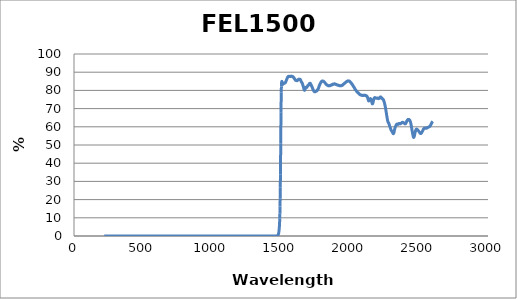
| Category | Series 0 |
|---|---|
| 2600.0 | 62.922 |
| 2599.0 | 62.853 |
| 2598.0 | 62.781 |
| 2597.0 | 62.614 |
| 2596.0 | 62.554 |
| 2595.0 | 62.516 |
| 2594.0 | 62.323 |
| 2593.0 | 62.304 |
| 2592.0 | 62.064 |
| 2591.0 | 61.961 |
| 2590.0 | 61.849 |
| 2589.0 | 61.631 |
| 2588.0 | 61.532 |
| 2587.0 | 61.363 |
| 2586.0 | 61.228 |
| 2585.0 | 60.982 |
| 2584.0 | 60.89 |
| 2583.0 | 60.751 |
| 2582.0 | 60.561 |
| 2581.0 | 60.436 |
| 2580.0 | 60.378 |
| 2579.0 | 60.279 |
| 2578.0 | 60.185 |
| 2577.0 | 60.151 |
| 2576.0 | 60.1 |
| 2575.0 | 60.062 |
| 2574.0 | 59.996 |
| 2573.0 | 60.008 |
| 2572.0 | 59.98 |
| 2571.0 | 59.939 |
| 2570.0 | 59.921 |
| 2569.0 | 59.88 |
| 2568.0 | 59.86 |
| 2567.0 | 59.742 |
| 2566.0 | 59.752 |
| 2565.0 | 59.658 |
| 2564.0 | 59.593 |
| 2563.0 | 59.543 |
| 2562.0 | 59.594 |
| 2561.0 | 59.501 |
| 2560.0 | 59.414 |
| 2559.0 | 59.441 |
| 2558.0 | 59.399 |
| 2557.0 | 59.34 |
| 2556.0 | 59.265 |
| 2555.0 | 59.249 |
| 2554.0 | 59.242 |
| 2553.0 | 59.218 |
| 2552.0 | 59.218 |
| 2551.0 | 59.211 |
| 2550.0 | 59.242 |
| 2549.0 | 59.283 |
| 2548.0 | 59.319 |
| 2547.0 | 59.331 |
| 2546.0 | 59.348 |
| 2545.0 | 59.289 |
| 2544.0 | 59.322 |
| 2543.0 | 59.22 |
| 2542.0 | 59.276 |
| 2541.0 | 59.227 |
| 2540.0 | 59.195 |
| 2539.0 | 59.211 |
| 2538.0 | 59.141 |
| 2537.0 | 59.007 |
| 2536.0 | 59.02 |
| 2535.0 | 58.89 |
| 2534.0 | 58.814 |
| 2533.0 | 58.695 |
| 2532.0 | 58.75 |
| 2531.0 | 58.476 |
| 2530.0 | 58.326 |
| 2529.0 | 58.179 |
| 2528.0 | 58.032 |
| 2527.0 | 57.936 |
| 2526.0 | 57.79 |
| 2525.0 | 57.601 |
| 2524.0 | 57.449 |
| 2523.0 | 57.298 |
| 2522.0 | 57.184 |
| 2521.0 | 57.027 |
| 2520.0 | 56.881 |
| 2519.0 | 56.801 |
| 2518.0 | 56.67 |
| 2517.0 | 56.536 |
| 2516.0 | 56.461 |
| 2515.0 | 56.467 |
| 2514.0 | 56.293 |
| 2513.0 | 56.321 |
| 2512.0 | 56.376 |
| 2511.0 | 56.391 |
| 2510.0 | 56.32 |
| 2509.0 | 56.47 |
| 2508.0 | 56.503 |
| 2507.0 | 56.524 |
| 2506.0 | 56.691 |
| 2505.0 | 56.832 |
| 2504.0 | 56.911 |
| 2503.0 | 57.034 |
| 2502.0 | 57.179 |
| 2501.0 | 57.285 |
| 2500.0 | 57.359 |
| 2499.0 | 57.577 |
| 2498.0 | 57.599 |
| 2497.0 | 57.631 |
| 2496.0 | 57.787 |
| 2495.0 | 57.876 |
| 2494.0 | 57.946 |
| 2493.0 | 58.059 |
| 2492.0 | 58.167 |
| 2491.0 | 58.24 |
| 2490.0 | 58.25 |
| 2489.0 | 58.31 |
| 2488.0 | 58.474 |
| 2487.0 | 58.525 |
| 2486.0 | 58.617 |
| 2485.0 | 58.649 |
| 2484.0 | 58.666 |
| 2483.0 | 58.757 |
| 2482.0 | 58.726 |
| 2481.0 | 58.658 |
| 2480.0 | 58.641 |
| 2479.0 | 58.595 |
| 2478.0 | 58.38 |
| 2477.0 | 58.194 |
| 2476.0 | 57.963 |
| 2475.0 | 57.787 |
| 2474.0 | 57.487 |
| 2473.0 | 57.243 |
| 2472.0 | 56.933 |
| 2471.0 | 56.645 |
| 2470.0 | 56.298 |
| 2469.0 | 55.992 |
| 2468.0 | 55.499 |
| 2467.0 | 55.183 |
| 2466.0 | 54.953 |
| 2465.0 | 54.632 |
| 2464.0 | 54.408 |
| 2463.0 | 54.271 |
| 2462.0 | 54.224 |
| 2461.0 | 54.162 |
| 2460.0 | 54.362 |
| 2459.0 | 54.448 |
| 2458.0 | 54.757 |
| 2457.0 | 55.062 |
| 2456.0 | 55.416 |
| 2455.0 | 55.785 |
| 2454.0 | 56.198 |
| 2453.0 | 56.607 |
| 2452.0 | 57.021 |
| 2451.0 | 57.414 |
| 2450.0 | 57.923 |
| 2449.0 | 58.335 |
| 2448.0 | 58.745 |
| 2447.0 | 59.31 |
| 2446.0 | 59.612 |
| 2445.0 | 60.157 |
| 2444.0 | 60.591 |
| 2443.0 | 60.966 |
| 2442.0 | 61.34 |
| 2441.0 | 61.886 |
| 2440.0 | 62.058 |
| 2439.0 | 62.392 |
| 2438.0 | 62.674 |
| 2437.0 | 62.891 |
| 2436.0 | 63.062 |
| 2435.0 | 63.279 |
| 2434.0 | 63.489 |
| 2433.0 | 63.499 |
| 2432.0 | 63.651 |
| 2431.0 | 63.825 |
| 2430.0 | 63.768 |
| 2429.0 | 63.944 |
| 2428.0 | 64.008 |
| 2427.0 | 63.999 |
| 2426.0 | 63.941 |
| 2425.0 | 64.026 |
| 2424.0 | 63.998 |
| 2423.0 | 64.044 |
| 2422.0 | 64.008 |
| 2421.0 | 63.943 |
| 2420.0 | 63.927 |
| 2419.0 | 63.984 |
| 2418.0 | 63.854 |
| 2417.0 | 63.787 |
| 2416.0 | 63.732 |
| 2415.0 | 63.579 |
| 2414.0 | 63.417 |
| 2413.0 | 63.346 |
| 2412.0 | 63.273 |
| 2411.0 | 62.972 |
| 2410.0 | 62.841 |
| 2409.0 | 62.686 |
| 2408.0 | 62.454 |
| 2407.0 | 62.307 |
| 2406.0 | 62.149 |
| 2405.0 | 61.922 |
| 2404.0 | 61.833 |
| 2403.0 | 61.847 |
| 2402.0 | 61.653 |
| 2401.0 | 61.647 |
| 2400.0 | 61.702 |
| 2399.0 | 61.698 |
| 2398.0 | 61.637 |
| 2397.0 | 61.84 |
| 2396.0 | 61.865 |
| 2395.0 | 61.884 |
| 2394.0 | 61.985 |
| 2393.0 | 61.988 |
| 2392.0 | 61.987 |
| 2391.0 | 62.129 |
| 2390.0 | 62.099 |
| 2389.0 | 62.183 |
| 2388.0 | 62.184 |
| 2387.0 | 62.23 |
| 2386.0 | 62.266 |
| 2385.0 | 62.353 |
| 2384.0 | 62.432 |
| 2383.0 | 62.466 |
| 2382.0 | 62.469 |
| 2381.0 | 62.424 |
| 2380.0 | 62.398 |
| 2379.0 | 62.418 |
| 2378.0 | 62.368 |
| 2377.0 | 62.329 |
| 2376.0 | 62.349 |
| 2375.0 | 62.254 |
| 2374.0 | 62.141 |
| 2373.0 | 62.124 |
| 2372.0 | 61.98 |
| 2371.0 | 61.963 |
| 2370.0 | 61.891 |
| 2369.0 | 61.844 |
| 2368.0 | 61.769 |
| 2367.0 | 61.719 |
| 2366.0 | 61.711 |
| 2365.0 | 61.633 |
| 2364.0 | 61.676 |
| 2363.0 | 61.605 |
| 2362.0 | 61.696 |
| 2361.0 | 61.821 |
| 2360.0 | 61.769 |
| 2359.0 | 61.765 |
| 2358.0 | 61.839 |
| 2357.0 | 61.791 |
| 2356.0 | 61.802 |
| 2355.0 | 61.816 |
| 2354.0 | 61.659 |
| 2353.0 | 61.567 |
| 2352.0 | 61.592 |
| 2351.0 | 61.54 |
| 2350.0 | 61.466 |
| 2349.0 | 61.416 |
| 2348.0 | 61.313 |
| 2347.0 | 61.42 |
| 2346.0 | 61.485 |
| 2345.0 | 61.478 |
| 2344.0 | 61.373 |
| 2343.0 | 61.488 |
| 2342.0 | 61.417 |
| 2341.0 | 61.464 |
| 2340.0 | 61.472 |
| 2339.0 | 61.414 |
| 2338.0 | 61.323 |
| 2337.0 | 61.269 |
| 2336.0 | 61.164 |
| 2335.0 | 61.062 |
| 2334.0 | 60.948 |
| 2333.0 | 60.753 |
| 2332.0 | 60.601 |
| 2331.0 | 60.503 |
| 2330.0 | 60.198 |
| 2329.0 | 60.065 |
| 2328.0 | 59.872 |
| 2327.0 | 59.574 |
| 2326.0 | 59.34 |
| 2325.0 | 59.081 |
| 2324.0 | 58.827 |
| 2323.0 | 58.412 |
| 2322.0 | 58.151 |
| 2321.0 | 57.839 |
| 2320.0 | 57.397 |
| 2319.0 | 57.053 |
| 2318.0 | 56.7 |
| 2317.0 | 56.525 |
| 2316.0 | 56.389 |
| 2315.0 | 56.237 |
| 2314.0 | 56.256 |
| 2313.0 | 56.32 |
| 2312.0 | 56.328 |
| 2311.0 | 56.465 |
| 2310.0 | 56.662 |
| 2309.0 | 56.827 |
| 2308.0 | 57.032 |
| 2307.0 | 57.216 |
| 2306.0 | 57.248 |
| 2305.0 | 57.454 |
| 2304.0 | 57.558 |
| 2303.0 | 57.576 |
| 2302.0 | 57.665 |
| 2301.0 | 57.779 |
| 2300.0 | 57.961 |
| 2299.0 | 58.073 |
| 2298.0 | 58.268 |
| 2297.0 | 58.375 |
| 2296.0 | 58.63 |
| 2295.0 | 58.788 |
| 2294.0 | 59.048 |
| 2293.0 | 59.279 |
| 2292.0 | 59.525 |
| 2291.0 | 59.719 |
| 2290.0 | 59.916 |
| 2289.0 | 60.204 |
| 2288.0 | 60.28 |
| 2287.0 | 60.57 |
| 2286.0 | 60.894 |
| 2285.0 | 61.07 |
| 2284.0 | 61.344 |
| 2283.0 | 61.565 |
| 2282.0 | 61.743 |
| 2281.0 | 61.892 |
| 2280.0 | 62.06 |
| 2279.0 | 62.303 |
| 2278.0 | 62.322 |
| 2277.0 | 62.527 |
| 2276.0 | 62.667 |
| 2275.0 | 62.828 |
| 2274.0 | 63.092 |
| 2273.0 | 63.212 |
| 2272.0 | 63.616 |
| 2271.0 | 63.984 |
| 2270.0 | 64.363 |
| 2269.0 | 64.881 |
| 2268.0 | 65.367 |
| 2267.0 | 65.838 |
| 2266.0 | 66.344 |
| 2265.0 | 66.77 |
| 2264.0 | 67.257 |
| 2263.0 | 67.804 |
| 2262.0 | 68.284 |
| 2261.0 | 68.678 |
| 2260.0 | 69.147 |
| 2259.0 | 69.634 |
| 2258.0 | 70.017 |
| 2257.0 | 70.482 |
| 2256.0 | 70.932 |
| 2255.0 | 71.269 |
| 2254.0 | 71.645 |
| 2253.0 | 72.026 |
| 2252.0 | 72.374 |
| 2251.0 | 72.754 |
| 2250.0 | 73.072 |
| 2249.0 | 73.265 |
| 2248.0 | 73.589 |
| 2247.0 | 73.771 |
| 2246.0 | 74.048 |
| 2245.0 | 74.27 |
| 2244.0 | 74.499 |
| 2243.0 | 74.759 |
| 2242.0 | 74.785 |
| 2241.0 | 74.883 |
| 2240.0 | 75.101 |
| 2239.0 | 75.122 |
| 2238.0 | 75.123 |
| 2237.0 | 75.383 |
| 2236.0 | 75.344 |
| 2235.0 | 75.432 |
| 2234.0 | 75.414 |
| 2233.0 | 75.564 |
| 2232.0 | 75.639 |
| 2231.0 | 75.671 |
| 2230.0 | 75.686 |
| 2229.0 | 75.822 |
| 2228.0 | 75.956 |
| 2227.0 | 75.966 |
| 2226.0 | 76.151 |
| 2225.0 | 76.233 |
| 2224.0 | 76.193 |
| 2223.0 | 76.306 |
| 2222.0 | 76.422 |
| 2221.0 | 76.394 |
| 2220.0 | 76.26 |
| 2219.0 | 76.313 |
| 2218.0 | 76.148 |
| 2217.0 | 76.21 |
| 2216.0 | 76.142 |
| 2215.0 | 76.001 |
| 2214.0 | 75.885 |
| 2213.0 | 75.953 |
| 2212.0 | 75.679 |
| 2211.0 | 75.626 |
| 2210.0 | 75.607 |
| 2209.0 | 75.538 |
| 2208.0 | 75.488 |
| 2207.0 | 75.559 |
| 2206.0 | 75.552 |
| 2205.0 | 75.471 |
| 2204.0 | 75.572 |
| 2203.0 | 75.568 |
| 2202.0 | 75.674 |
| 2201.0 | 75.744 |
| 2200.0 | 75.745 |
| 2199.0 | 75.774 |
| 2198.0 | 75.756 |
| 2197.0 | 75.786 |
| 2196.0 | 75.795 |
| 2195.0 | 75.781 |
| 2194.0 | 75.677 |
| 2193.0 | 75.711 |
| 2192.0 | 75.697 |
| 2191.0 | 75.729 |
| 2190.0 | 75.727 |
| 2189.0 | 75.69 |
| 2188.0 | 75.668 |
| 2187.0 | 75.698 |
| 2186.0 | 75.738 |
| 2185.0 | 75.786 |
| 2184.0 | 75.963 |
| 2183.0 | 75.949 |
| 2182.0 | 75.978 |
| 2181.0 | 75.94 |
| 2180.0 | 76.043 |
| 2179.0 | 76.033 |
| 2178.0 | 75.915 |
| 2177.0 | 75.958 |
| 2176.0 | 75.886 |
| 2175.0 | 75.697 |
| 2174.0 | 75.561 |
| 2173.0 | 75.276 |
| 2172.0 | 75.123 |
| 2171.0 | 74.911 |
| 2170.0 | 74.481 |
| 2169.0 | 74.116 |
| 2168.0 | 73.759 |
| 2167.0 | 73.441 |
| 2166.0 | 73.052 |
| 2165.0 | 72.825 |
| 2164.0 | 72.744 |
| 2163.0 | 72.666 |
| 2162.0 | 72.587 |
| 2161.0 | 72.703 |
| 2160.0 | 73.015 |
| 2159.0 | 73.215 |
| 2158.0 | 73.496 |
| 2157.0 | 73.784 |
| 2156.0 | 74.043 |
| 2155.0 | 74.27 |
| 2154.0 | 74.588 |
| 2153.0 | 74.897 |
| 2152.0 | 75.072 |
| 2151.0 | 75.299 |
| 2150.0 | 75.355 |
| 2149.0 | 75.417 |
| 2148.0 | 75.488 |
| 2147.0 | 75.51 |
| 2146.0 | 75.41 |
| 2145.0 | 75.41 |
| 2144.0 | 75.268 |
| 2143.0 | 75.166 |
| 2142.0 | 74.991 |
| 2141.0 | 74.88 |
| 2140.0 | 74.632 |
| 2139.0 | 74.555 |
| 2138.0 | 74.294 |
| 2137.0 | 74.256 |
| 2136.0 | 74.275 |
| 2135.0 | 74.223 |
| 2134.0 | 74.416 |
| 2133.0 | 74.602 |
| 2132.0 | 74.896 |
| 2131.0 | 75.05 |
| 2130.0 | 75.418 |
| 2129.0 | 75.686 |
| 2128.0 | 75.95 |
| 2127.0 | 76.159 |
| 2126.0 | 76.429 |
| 2125.0 | 76.505 |
| 2124.0 | 76.572 |
| 2123.0 | 76.716 |
| 2122.0 | 76.893 |
| 2121.0 | 76.931 |
| 2120.0 | 76.921 |
| 2119.0 | 76.901 |
| 2118.0 | 77.004 |
| 2117.0 | 76.981 |
| 2116.0 | 77.179 |
| 2115.0 | 77.126 |
| 2114.0 | 77.192 |
| 2113.0 | 77.156 |
| 2112.0 | 77.233 |
| 2111.0 | 77.218 |
| 2110.0 | 77.282 |
| 2109.0 | 77.341 |
| 2108.0 | 77.351 |
| 2107.0 | 77.326 |
| 2106.0 | 77.261 |
| 2105.0 | 77.351 |
| 2104.0 | 77.294 |
| 2103.0 | 77.333 |
| 2102.0 | 77.397 |
| 2101.0 | 77.275 |
| 2100.0 | 77.318 |
| 2099.0 | 77.346 |
| 2098.0 | 77.268 |
| 2097.0 | 77.284 |
| 2096.0 | 77.213 |
| 2095.0 | 77.294 |
| 2094.0 | 77.208 |
| 2093.0 | 77.262 |
| 2092.0 | 77.178 |
| 2091.0 | 77.36 |
| 2090.0 | 77.274 |
| 2089.0 | 77.304 |
| 2088.0 | 77.264 |
| 2087.0 | 77.332 |
| 2086.0 | 77.32 |
| 2085.0 | 77.246 |
| 2084.0 | 77.368 |
| 2083.0 | 77.337 |
| 2082.0 | 77.434 |
| 2081.0 | 77.42 |
| 2080.0 | 77.456 |
| 2079.0 | 77.49 |
| 2078.0 | 77.466 |
| 2077.0 | 77.577 |
| 2076.0 | 77.514 |
| 2075.0 | 77.6 |
| 2074.0 | 77.593 |
| 2073.0 | 77.671 |
| 2072.0 | 77.767 |
| 2071.0 | 77.81 |
| 2070.0 | 77.738 |
| 2069.0 | 77.947 |
| 2068.0 | 78.008 |
| 2067.0 | 78.046 |
| 2066.0 | 78.172 |
| 2065.0 | 78.293 |
| 2064.0 | 78.249 |
| 2063.0 | 78.309 |
| 2062.0 | 78.458 |
| 2061.0 | 78.523 |
| 2060.0 | 78.658 |
| 2059.0 | 78.675 |
| 2058.0 | 78.789 |
| 2057.0 | 78.753 |
| 2056.0 | 78.894 |
| 2055.0 | 78.89 |
| 2054.0 | 78.972 |
| 2053.0 | 78.994 |
| 2052.0 | 79.133 |
| 2051.0 | 79.245 |
| 2050.0 | 79.297 |
| 2049.0 | 79.326 |
| 2048.0 | 79.622 |
| 2047.0 | 79.744 |
| 2046.0 | 79.754 |
| 2045.0 | 79.852 |
| 2044.0 | 79.95 |
| 2043.0 | 80.057 |
| 2042.0 | 80.175 |
| 2041.0 | 80.342 |
| 2040.0 | 80.305 |
| 2039.0 | 80.493 |
| 2038.0 | 80.592 |
| 2037.0 | 80.665 |
| 2036.0 | 80.773 |
| 2035.0 | 81.025 |
| 2034.0 | 81.056 |
| 2033.0 | 81.262 |
| 2032.0 | 81.293 |
| 2031.0 | 81.463 |
| 2030.0 | 81.552 |
| 2029.0 | 81.839 |
| 2028.0 | 81.787 |
| 2027.0 | 81.995 |
| 2026.0 | 82.133 |
| 2025.0 | 82.195 |
| 2024.0 | 82.31 |
| 2023.0 | 82.413 |
| 2022.0 | 82.669 |
| 2021.0 | 82.753 |
| 2020.0 | 82.828 |
| 2019.0 | 82.917 |
| 2018.0 | 82.995 |
| 2017.0 | 83.15 |
| 2016.0 | 83.359 |
| 2015.0 | 83.351 |
| 2014.0 | 83.509 |
| 2013.0 | 83.582 |
| 2012.0 | 83.629 |
| 2011.0 | 83.734 |
| 2010.0 | 83.959 |
| 2009.0 | 84.012 |
| 2008.0 | 83.976 |
| 2007.0 | 84.212 |
| 2006.0 | 84.289 |
| 2005.0 | 84.376 |
| 2004.0 | 84.459 |
| 2003.0 | 84.506 |
| 2002.0 | 84.541 |
| 2001.0 | 84.606 |
| 2000.0 | 84.727 |
| 1999.0 | 84.93 |
| 1998.0 | 84.909 |
| 1997.0 | 84.921 |
| 1996.0 | 84.986 |
| 1995.0 | 85.028 |
| 1994.0 | 85.162 |
| 1993.0 | 85.141 |
| 1992.0 | 85.142 |
| 1991.0 | 85.231 |
| 1990.0 | 85.216 |
| 1989.0 | 85.168 |
| 1988.0 | 85.13 |
| 1987.0 | 85.239 |
| 1986.0 | 85.146 |
| 1985.0 | 85.221 |
| 1984.0 | 85.228 |
| 1983.0 | 85.126 |
| 1982.0 | 85.049 |
| 1981.0 | 85.082 |
| 1980.0 | 85.091 |
| 1979.0 | 84.988 |
| 1978.0 | 84.993 |
| 1977.0 | 84.827 |
| 1976.0 | 84.837 |
| 1975.0 | 84.802 |
| 1974.0 | 84.788 |
| 1973.0 | 84.623 |
| 1972.0 | 84.632 |
| 1971.0 | 84.581 |
| 1970.0 | 84.594 |
| 1969.0 | 84.396 |
| 1968.0 | 84.377 |
| 1967.0 | 84.339 |
| 1966.0 | 84.269 |
| 1965.0 | 84.205 |
| 1964.0 | 84.123 |
| 1963.0 | 84.104 |
| 1962.0 | 84.022 |
| 1961.0 | 83.856 |
| 1960.0 | 83.864 |
| 1959.0 | 83.768 |
| 1958.0 | 83.818 |
| 1957.0 | 83.707 |
| 1956.0 | 83.648 |
| 1955.0 | 83.552 |
| 1954.0 | 83.533 |
| 1953.0 | 83.402 |
| 1952.0 | 83.397 |
| 1951.0 | 83.281 |
| 1950.0 | 83.278 |
| 1949.0 | 83.225 |
| 1948.0 | 83.023 |
| 1947.0 | 83.05 |
| 1946.0 | 82.954 |
| 1945.0 | 82.822 |
| 1944.0 | 82.809 |
| 1943.0 | 82.744 |
| 1942.0 | 82.821 |
| 1941.0 | 82.716 |
| 1940.0 | 82.655 |
| 1939.0 | 82.635 |
| 1938.0 | 82.582 |
| 1937.0 | 82.717 |
| 1936.0 | 82.555 |
| 1935.0 | 82.66 |
| 1934.0 | 82.563 |
| 1933.0 | 82.665 |
| 1932.0 | 82.617 |
| 1931.0 | 82.612 |
| 1930.0 | 82.53 |
| 1929.0 | 82.49 |
| 1928.0 | 82.52 |
| 1927.0 | 82.546 |
| 1926.0 | 82.536 |
| 1925.0 | 82.56 |
| 1924.0 | 82.632 |
| 1923.0 | 82.534 |
| 1922.0 | 82.595 |
| 1921.0 | 82.595 |
| 1920.0 | 82.67 |
| 1919.0 | 82.773 |
| 1918.0 | 82.805 |
| 1917.0 | 82.718 |
| 1916.0 | 82.789 |
| 1915.0 | 82.773 |
| 1914.0 | 82.765 |
| 1913.0 | 82.769 |
| 1912.0 | 82.798 |
| 1911.0 | 82.881 |
| 1910.0 | 82.909 |
| 1909.0 | 83.013 |
| 1908.0 | 83.001 |
| 1907.0 | 83.032 |
| 1906.0 | 83.053 |
| 1905.0 | 83.13 |
| 1904.0 | 83.071 |
| 1903.0 | 83.173 |
| 1902.0 | 83.266 |
| 1901.0 | 83.129 |
| 1900.0 | 83.249 |
| 1899.0 | 83.327 |
| 1898.0 | 83.287 |
| 1897.0 | 83.346 |
| 1896.0 | 83.394 |
| 1895.0 | 83.352 |
| 1894.0 | 83.381 |
| 1893.0 | 83.509 |
| 1892.0 | 83.417 |
| 1891.0 | 83.551 |
| 1890.0 | 83.54 |
| 1889.0 | 83.666 |
| 1888.0 | 83.602 |
| 1887.0 | 83.56 |
| 1886.0 | 83.49 |
| 1885.0 | 83.551 |
| 1884.0 | 83.441 |
| 1883.0 | 83.44 |
| 1882.0 | 83.425 |
| 1881.0 | 83.452 |
| 1880.0 | 83.455 |
| 1879.0 | 83.483 |
| 1878.0 | 83.364 |
| 1877.0 | 83.291 |
| 1876.0 | 83.45 |
| 1875.0 | 83.341 |
| 1874.0 | 83.31 |
| 1873.0 | 83.302 |
| 1872.0 | 83.259 |
| 1871.0 | 83.246 |
| 1870.0 | 83.221 |
| 1869.0 | 83.007 |
| 1868.0 | 83.047 |
| 1867.0 | 82.978 |
| 1866.0 | 83.068 |
| 1865.0 | 82.993 |
| 1864.0 | 82.848 |
| 1863.0 | 82.964 |
| 1862.0 | 82.779 |
| 1861.0 | 82.779 |
| 1860.0 | 82.769 |
| 1859.0 | 82.77 |
| 1858.0 | 82.787 |
| 1857.0 | 82.764 |
| 1856.0 | 82.61 |
| 1855.0 | 82.67 |
| 1854.0 | 82.626 |
| 1853.0 | 82.646 |
| 1852.0 | 82.555 |
| 1851.0 | 82.574 |
| 1850.0 | 82.565 |
| 1849.0 | 82.507 |
| 1848.0 | 82.533 |
| 1847.0 | 82.488 |
| 1846.0 | 82.557 |
| 1845.0 | 82.63 |
| 1844.0 | 82.496 |
| 1843.0 | 82.556 |
| 1842.0 | 82.567 |
| 1841.0 | 82.717 |
| 1840.0 | 82.644 |
| 1839.0 | 82.699 |
| 1838.0 | 82.717 |
| 1837.0 | 82.893 |
| 1836.0 | 82.826 |
| 1835.0 | 82.897 |
| 1834.0 | 82.995 |
| 1833.0 | 82.915 |
| 1832.0 | 83.019 |
| 1831.0 | 83.047 |
| 1830.0 | 83.153 |
| 1829.0 | 83.295 |
| 1828.0 | 83.326 |
| 1827.0 | 83.356 |
| 1826.0 | 83.47 |
| 1825.0 | 83.657 |
| 1824.0 | 83.734 |
| 1823.0 | 83.798 |
| 1822.0 | 83.823 |
| 1821.0 | 84.021 |
| 1820.0 | 84.113 |
| 1819.0 | 84.209 |
| 1818.0 | 84.227 |
| 1817.0 | 84.269 |
| 1816.0 | 84.522 |
| 1815.0 | 84.455 |
| 1814.0 | 84.637 |
| 1813.0 | 84.64 |
| 1812.0 | 84.755 |
| 1811.0 | 84.73 |
| 1810.0 | 84.788 |
| 1809.0 | 84.933 |
| 1808.0 | 85.012 |
| 1807.0 | 84.944 |
| 1806.0 | 85.025 |
| 1805.0 | 85.042 |
| 1804.0 | 85.137 |
| 1803.0 | 85.087 |
| 1802.0 | 85.141 |
| 1801.0 | 85.075 |
| 1800.0 | 85.106 |
| 1799.0 | 85.079 |
| 1798.0 | 85.013 |
| 1797.0 | 85.106 |
| 1796.0 | 85.066 |
| 1795.0 | 84.956 |
| 1794.0 | 84.862 |
| 1793.0 | 84.791 |
| 1792.0 | 84.745 |
| 1791.0 | 84.59 |
| 1790.0 | 84.469 |
| 1789.0 | 84.451 |
| 1788.0 | 84.28 |
| 1787.0 | 84.149 |
| 1786.0 | 84.044 |
| 1785.0 | 83.785 |
| 1784.0 | 83.726 |
| 1783.0 | 83.558 |
| 1782.0 | 83.369 |
| 1781.0 | 83.246 |
| 1780.0 | 83.068 |
| 1779.0 | 82.859 |
| 1778.0 | 82.512 |
| 1777.0 | 82.411 |
| 1776.0 | 82.305 |
| 1775.0 | 81.951 |
| 1774.0 | 81.783 |
| 1773.0 | 81.604 |
| 1772.0 | 81.372 |
| 1771.0 | 81.095 |
| 1770.0 | 80.878 |
| 1769.0 | 80.902 |
| 1768.0 | 80.645 |
| 1767.0 | 80.615 |
| 1766.0 | 80.462 |
| 1765.0 | 80.385 |
| 1764.0 | 80.227 |
| 1763.0 | 80.229 |
| 1762.0 | 80.145 |
| 1761.0 | 79.983 |
| 1760.0 | 79.75 |
| 1759.0 | 79.733 |
| 1758.0 | 79.69 |
| 1757.0 | 79.577 |
| 1756.0 | 79.572 |
| 1755.0 | 79.548 |
| 1754.0 | 79.525 |
| 1753.0 | 79.488 |
| 1752.0 | 79.483 |
| 1751.0 | 79.425 |
| 1750.0 | 79.41 |
| 1749.0 | 79.432 |
| 1748.0 | 79.401 |
| 1747.0 | 79.27 |
| 1746.0 | 79.461 |
| 1745.0 | 79.26 |
| 1744.0 | 79.297 |
| 1743.0 | 79.313 |
| 1742.0 | 79.231 |
| 1741.0 | 79.314 |
| 1740.0 | 79.405 |
| 1739.0 | 79.485 |
| 1738.0 | 79.657 |
| 1737.0 | 79.855 |
| 1736.0 | 79.877 |
| 1735.0 | 80.084 |
| 1734.0 | 80.199 |
| 1733.0 | 80.436 |
| 1732.0 | 80.547 |
| 1731.0 | 80.773 |
| 1730.0 | 80.894 |
| 1729.0 | 81.068 |
| 1728.0 | 81.321 |
| 1727.0 | 81.471 |
| 1726.0 | 81.75 |
| 1725.0 | 81.8 |
| 1724.0 | 82.142 |
| 1723.0 | 82.169 |
| 1722.0 | 82.362 |
| 1721.0 | 82.556 |
| 1720.0 | 82.608 |
| 1719.0 | 82.931 |
| 1718.0 | 83.005 |
| 1717.0 | 83.293 |
| 1716.0 | 83.329 |
| 1715.0 | 83.503 |
| 1714.0 | 83.61 |
| 1713.0 | 83.839 |
| 1712.0 | 83.756 |
| 1711.0 | 83.878 |
| 1710.0 | 83.83 |
| 1709.0 | 83.862 |
| 1708.0 | 83.868 |
| 1707.0 | 83.74 |
| 1706.0 | 83.741 |
| 1705.0 | 83.578 |
| 1704.0 | 83.446 |
| 1703.0 | 83.353 |
| 1702.0 | 83.25 |
| 1701.0 | 83.01 |
| 1700.0 | 82.972 |
| 1699.0 | 82.844 |
| 1698.0 | 82.782 |
| 1697.0 | 82.82 |
| 1696.0 | 82.781 |
| 1695.0 | 82.725 |
| 1694.0 | 82.58 |
| 1693.0 | 82.506 |
| 1692.0 | 82.279 |
| 1691.0 | 82.19 |
| 1690.0 | 81.991 |
| 1689.0 | 81.916 |
| 1688.0 | 81.72 |
| 1687.0 | 81.724 |
| 1686.0 | 81.662 |
| 1685.0 | 81.632 |
| 1684.0 | 81.713 |
| 1683.0 | 81.702 |
| 1682.0 | 81.702 |
| 1681.0 | 81.69 |
| 1680.0 | 81.592 |
| 1679.0 | 81.541 |
| 1678.0 | 81.34 |
| 1677.0 | 81.104 |
| 1676.0 | 80.96 |
| 1675.0 | 80.745 |
| 1674.0 | 80.558 |
| 1673.0 | 80.45 |
| 1672.0 | 80.234 |
| 1671.0 | 80.014 |
| 1670.0 | 80.203 |
| 1669.0 | 80.247 |
| 1668.0 | 80.171 |
| 1667.0 | 80.459 |
| 1666.0 | 80.718 |
| 1665.0 | 81.099 |
| 1664.0 | 81.41 |
| 1663.0 | 81.694 |
| 1662.0 | 82.035 |
| 1661.0 | 82.313 |
| 1660.0 | 82.516 |
| 1659.0 | 82.827 |
| 1658.0 | 82.985 |
| 1657.0 | 83.183 |
| 1656.0 | 83.545 |
| 1655.0 | 83.751 |
| 1654.0 | 83.889 |
| 1653.0 | 84.059 |
| 1652.0 | 84.257 |
| 1651.0 | 84.356 |
| 1650.0 | 84.401 |
| 1649.0 | 84.576 |
| 1648.0 | 84.678 |
| 1647.0 | 84.73 |
| 1646.0 | 85.055 |
| 1645.0 | 85.07 |
| 1644.0 | 85.303 |
| 1643.0 | 85.513 |
| 1642.0 | 85.747 |
| 1641.0 | 85.742 |
| 1640.0 | 85.934 |
| 1639.0 | 86.021 |
| 1638.0 | 86.103 |
| 1637.0 | 85.986 |
| 1636.0 | 86.154 |
| 1635.0 | 86.067 |
| 1634.0 | 86.116 |
| 1633.0 | 86.018 |
| 1632.0 | 86.05 |
| 1631.0 | 86.163 |
| 1630.0 | 86.091 |
| 1629.0 | 86.17 |
| 1628.0 | 86.012 |
| 1627.0 | 85.979 |
| 1626.0 | 85.917 |
| 1625.0 | 85.917 |
| 1624.0 | 85.916 |
| 1623.0 | 85.802 |
| 1622.0 | 85.6 |
| 1621.0 | 85.701 |
| 1620.0 | 85.582 |
| 1619.0 | 85.536 |
| 1618.0 | 85.445 |
| 1617.0 | 85.331 |
| 1616.0 | 85.473 |
| 1615.0 | 85.389 |
| 1614.0 | 85.39 |
| 1613.0 | 85.421 |
| 1612.0 | 85.454 |
| 1611.0 | 85.378 |
| 1610.0 | 85.506 |
| 1609.0 | 85.604 |
| 1608.0 | 85.543 |
| 1607.0 | 85.498 |
| 1606.0 | 85.551 |
| 1605.0 | 85.577 |
| 1604.0 | 85.755 |
| 1603.0 | 85.814 |
| 1602.0 | 85.934 |
| 1601.0 | 86.023 |
| 1600.0 | 86.099 |
| 1599.0 | 86.317 |
| 1598.0 | 86.4 |
| 1597.0 | 86.552 |
| 1596.0 | 86.593 |
| 1595.0 | 86.656 |
| 1594.0 | 86.988 |
| 1593.0 | 86.936 |
| 1592.0 | 86.922 |
| 1591.0 | 87.149 |
| 1590.0 | 87.141 |
| 1589.0 | 87.312 |
| 1588.0 | 87.397 |
| 1587.0 | 87.474 |
| 1586.0 | 87.456 |
| 1585.0 | 87.625 |
| 1584.0 | 87.652 |
| 1583.0 | 87.695 |
| 1582.0 | 87.714 |
| 1581.0 | 87.734 |
| 1580.0 | 87.726 |
| 1579.0 | 87.782 |
| 1578.0 | 87.685 |
| 1577.0 | 87.839 |
| 1576.0 | 87.74 |
| 1575.0 | 87.796 |
| 1574.0 | 87.777 |
| 1573.0 | 87.757 |
| 1572.0 | 87.707 |
| 1571.0 | 87.744 |
| 1570.0 | 87.762 |
| 1569.0 | 87.681 |
| 1568.0 | 87.643 |
| 1567.0 | 87.723 |
| 1566.0 | 87.617 |
| 1565.0 | 87.741 |
| 1564.0 | 87.743 |
| 1563.0 | 87.663 |
| 1562.0 | 87.678 |
| 1561.0 | 87.649 |
| 1560.0 | 87.7 |
| 1559.0 | 87.667 |
| 1558.0 | 87.675 |
| 1557.0 | 87.694 |
| 1556.0 | 87.751 |
| 1555.0 | 87.651 |
| 1554.0 | 87.614 |
| 1553.0 | 87.664 |
| 1552.0 | 87.597 |
| 1551.0 | 87.568 |
| 1550.0 | 87.392 |
| 1549.0 | 87.279 |
| 1548.0 | 87.131 |
| 1547.0 | 87.113 |
| 1546.0 | 86.893 |
| 1545.0 | 86.729 |
| 1544.0 | 86.597 |
| 1543.0 | 86.376 |
| 1542.0 | 86.158 |
| 1541.0 | 85.967 |
| 1540.0 | 85.796 |
| 1539.0 | 85.521 |
| 1538.0 | 85.336 |
| 1537.0 | 85.153 |
| 1536.0 | 84.978 |
| 1535.0 | 84.852 |
| 1534.0 | 84.646 |
| 1533.0 | 84.448 |
| 1532.0 | 84.345 |
| 1531.0 | 84.181 |
| 1530.0 | 84.29 |
| 1529.0 | 84.184 |
| 1528.0 | 84.101 |
| 1527.0 | 84.082 |
| 1526.0 | 83.952 |
| 1525.0 | 83.984 |
| 1524.0 | 83.889 |
| 1523.0 | 83.858 |
| 1522.0 | 83.837 |
| 1521.0 | 83.985 |
| 1520.0 | 83.949 |
| 1519.0 | 83.919 |
| 1518.0 | 83.788 |
| 1517.0 | 83.634 |
| 1516.0 | 83.638 |
| 1515.0 | 83.427 |
| 1514.0 | 83.47 |
| 1513.0 | 83.603 |
| 1512.0 | 83.641 |
| 1511.0 | 83.857 |
| 1510.0 | 84.082 |
| 1509.0 | 84.361 |
| 1508.0 | 84.606 |
| 1507.0 | 84.811 |
| 1506.0 | 84.978 |
| 1505.0 | 84.806 |
| 1504.0 | 83.837 |
| 1503.0 | 82.109 |
| 1502.0 | 78.982 |
| 1501.0 | 74.184 |
| 1500.0 | 67.652 |
| 1499.0 | 59.836 |
| 1498.0 | 50.749 |
| 1497.0 | 41.875 |
| 1496.0 | 33.716 |
| 1495.0 | 26.776 |
| 1494.0 | 20.804 |
| 1493.0 | 16.229 |
| 1492.0 | 12.526 |
| 1491.0 | 9.69 |
| 1490.0 | 7.616 |
| 1489.0 | 6.05 |
| 1488.0 | 4.834 |
| 1487.0 | 3.947 |
| 1486.0 | 3.233 |
| 1485.0 | 2.571 |
| 1484.0 | 1.979 |
| 1483.0 | 1.539 |
| 1482.0 | 1.194 |
| 1481.0 | 0.93 |
| 1480.0 | 0.732 |
| 1479.0 | 0.573 |
| 1478.0 | 0.452 |
| 1477.0 | 0.36 |
| 1476.0 | 0.289 |
| 1475.0 | 0.232 |
| 1474.0 | 0.188 |
| 1473.0 | 0.152 |
| 1472.0 | 0.123 |
| 1471.0 | 0.1 |
| 1470.0 | 0.083 |
| 1469.0 | 0.068 |
| 1468.0 | 0.056 |
| 1467.0 | 0.047 |
| 1466.0 | 0.039 |
| 1465.0 | 0.032 |
| 1464.0 | 0.027 |
| 1463.0 | 0.023 |
| 1462.0 | 0.019 |
| 1461.0 | 0.016 |
| 1460.0 | 0.014 |
| 1459.0 | 0.012 |
| 1458.0 | 0.01 |
| 1457.0 | 0.008 |
| 1456.0 | 0.007 |
| 1455.0 | 0.006 |
| 1454.0 | 0.005 |
| 1453.0 | 0.005 |
| 1452.0 | 0.004 |
| 1451.0 | 0.003 |
| 1450.0 | 0.003 |
| 1449.0 | 0.003 |
| 1448.0 | 0.002 |
| 1447.0 | 0.002 |
| 1446.0 | 0.002 |
| 1445.0 | 0.002 |
| 1444.0 | 0.001 |
| 1443.0 | 0.001 |
| 1442.0 | 0.001 |
| 1441.0 | 0.001 |
| 1440.0 | 0.001 |
| 1439.0 | 0.001 |
| 1438.0 | 0.001 |
| 1437.0 | 0.001 |
| 1436.0 | 0.001 |
| 1435.0 | 0.001 |
| 1434.0 | 0 |
| 1433.0 | 0.001 |
| 1432.0 | 0.001 |
| 1431.0 | 0 |
| 1430.0 | 0 |
| 1429.0 | 0 |
| 1428.0 | 0 |
| 1427.0 | 0 |
| 1426.0 | 0 |
| 1425.0 | 0 |
| 1424.0 | 0 |
| 1423.0 | 0 |
| 1422.0 | 0 |
| 1421.0 | 0 |
| 1420.0 | 0 |
| 1419.0 | 0 |
| 1418.0 | 0 |
| 1417.0 | 0 |
| 1416.0 | 0 |
| 1415.0 | 0 |
| 1414.0 | 0 |
| 1413.0 | 0 |
| 1412.0 | 0 |
| 1411.0 | 0 |
| 1410.0 | 0 |
| 1409.0 | 0 |
| 1408.0 | 0 |
| 1407.0 | 0 |
| 1406.0 | 0 |
| 1405.0 | 0 |
| 1404.0 | 0 |
| 1403.0 | 0 |
| 1402.0 | 0 |
| 1401.0 | 0 |
| 1400.0 | 0 |
| 1399.0 | 0 |
| 1398.0 | 0 |
| 1397.0 | 0 |
| 1396.0 | 0 |
| 1395.0 | 0 |
| 1394.0 | 0 |
| 1393.0 | 0 |
| 1392.0 | 0 |
| 1391.0 | 0 |
| 1390.0 | 0 |
| 1389.0 | 0 |
| 1388.0 | 0 |
| 1387.0 | 0 |
| 1386.0 | 0 |
| 1385.0 | 0 |
| 1384.0 | 0 |
| 1383.0 | 0 |
| 1382.0 | 0 |
| 1381.0 | 0 |
| 1380.0 | 0 |
| 1379.0 | 0 |
| 1378.0 | 0 |
| 1377.0 | 0 |
| 1376.0 | 0 |
| 1375.0 | 0 |
| 1374.0 | 0 |
| 1373.0 | 0 |
| 1372.0 | 0 |
| 1371.0 | 0 |
| 1370.0 | 0 |
| 1369.0 | 0 |
| 1368.0 | 0 |
| 1367.0 | 0 |
| 1366.0 | 0 |
| 1365.0 | 0 |
| 1364.0 | 0 |
| 1363.0 | 0 |
| 1362.0 | 0 |
| 1361.0 | 0 |
| 1360.0 | 0 |
| 1359.0 | 0 |
| 1358.0 | 0 |
| 1357.0 | 0 |
| 1356.0 | 0 |
| 1355.0 | 0 |
| 1354.0 | 0 |
| 1353.0 | 0 |
| 1352.0 | 0 |
| 1351.0 | 0 |
| 1350.0 | 0 |
| 1349.0 | 0 |
| 1348.0 | 0 |
| 1347.0 | 0 |
| 1346.0 | 0 |
| 1345.0 | 0 |
| 1344.0 | 0 |
| 1343.0 | 0 |
| 1342.0 | 0 |
| 1341.0 | 0 |
| 1340.0 | 0 |
| 1339.0 | 0 |
| 1338.0 | 0 |
| 1337.0 | 0 |
| 1336.0 | 0 |
| 1335.0 | 0 |
| 1334.0 | 0 |
| 1333.0 | 0 |
| 1332.0 | 0 |
| 1331.0 | 0 |
| 1330.0 | 0 |
| 1329.0 | 0 |
| 1328.0 | 0 |
| 1327.0 | 0 |
| 1326.0 | 0 |
| 1325.0 | 0 |
| 1324.0 | 0 |
| 1323.0 | 0 |
| 1322.0 | 0 |
| 1321.0 | 0 |
| 1320.0 | 0 |
| 1319.0 | 0 |
| 1318.0 | 0 |
| 1317.0 | 0 |
| 1316.0 | 0 |
| 1315.0 | 0 |
| 1314.0 | 0 |
| 1313.0 | 0 |
| 1312.0 | 0 |
| 1311.0 | 0 |
| 1310.0 | 0 |
| 1309.0 | 0 |
| 1308.0 | 0 |
| 1307.0 | 0 |
| 1306.0 | 0 |
| 1305.0 | 0 |
| 1304.0 | 0 |
| 1303.0 | 0 |
| 1302.0 | 0 |
| 1301.0 | 0 |
| 1300.0 | 0 |
| 1299.0 | 0 |
| 1298.0 | 0 |
| 1297.0 | 0 |
| 1296.0 | 0 |
| 1295.0 | 0 |
| 1294.0 | 0 |
| 1293.0 | 0 |
| 1292.0 | 0 |
| 1291.0 | 0 |
| 1290.0 | 0 |
| 1289.0 | 0 |
| 1288.0 | 0 |
| 1287.0 | 0 |
| 1286.0 | 0 |
| 1285.0 | 0 |
| 1284.0 | 0 |
| 1283.0 | 0 |
| 1282.0 | 0 |
| 1281.0 | 0 |
| 1280.0 | 0 |
| 1279.0 | 0 |
| 1278.0 | 0 |
| 1277.0 | 0 |
| 1276.0 | 0 |
| 1275.0 | 0 |
| 1274.0 | 0 |
| 1273.0 | 0 |
| 1272.0 | 0 |
| 1271.0 | 0 |
| 1270.0 | 0 |
| 1269.0 | 0 |
| 1268.0 | 0 |
| 1267.0 | 0 |
| 1266.0 | 0 |
| 1265.0 | 0 |
| 1264.0 | 0 |
| 1263.0 | 0 |
| 1262.0 | 0 |
| 1261.0 | 0 |
| 1260.0 | 0 |
| 1259.0 | 0 |
| 1258.0 | 0 |
| 1257.0 | 0 |
| 1256.0 | 0 |
| 1255.0 | 0 |
| 1254.0 | 0 |
| 1253.0 | 0 |
| 1252.0 | 0 |
| 1251.0 | 0 |
| 1250.0 | 0 |
| 1249.0 | 0 |
| 1248.0 | 0 |
| 1247.0 | 0 |
| 1246.0 | 0 |
| 1245.0 | 0 |
| 1244.0 | 0 |
| 1243.0 | 0 |
| 1242.0 | 0 |
| 1241.0 | 0 |
| 1240.0 | 0 |
| 1239.0 | 0 |
| 1238.0 | 0 |
| 1237.0 | 0 |
| 1236.0 | 0 |
| 1235.0 | 0 |
| 1234.0 | 0 |
| 1233.0 | 0 |
| 1232.0 | 0 |
| 1231.0 | 0 |
| 1230.0 | 0 |
| 1229.0 | 0 |
| 1228.0 | 0 |
| 1227.0 | 0 |
| 1226.0 | 0 |
| 1225.0 | 0 |
| 1224.0 | 0 |
| 1223.0 | 0 |
| 1222.0 | 0 |
| 1221.0 | 0 |
| 1220.0 | 0 |
| 1219.0 | 0 |
| 1218.0 | 0 |
| 1217.0 | 0 |
| 1216.0 | 0 |
| 1215.0 | 0 |
| 1214.0 | 0 |
| 1213.0 | 0 |
| 1212.0 | 0 |
| 1211.0 | 0 |
| 1210.0 | 0 |
| 1209.0 | 0 |
| 1208.0 | 0 |
| 1207.0 | 0 |
| 1206.0 | 0 |
| 1205.0 | 0 |
| 1204.0 | 0 |
| 1203.0 | 0 |
| 1202.0 | 0 |
| 1201.0 | 0 |
| 1200.0 | 0 |
| 1199.0 | 0 |
| 1198.0 | 0 |
| 1197.0 | 0 |
| 1196.0 | 0 |
| 1195.0 | 0 |
| 1194.0 | 0 |
| 1193.0 | 0 |
| 1192.0 | 0 |
| 1191.0 | 0 |
| 1190.0 | 0 |
| 1189.0 | 0 |
| 1188.0 | 0 |
| 1187.0 | 0 |
| 1186.0 | 0 |
| 1185.0 | 0 |
| 1184.0 | 0 |
| 1183.0 | 0 |
| 1182.0 | 0 |
| 1181.0 | 0 |
| 1180.0 | 0 |
| 1179.0 | 0 |
| 1178.0 | 0 |
| 1177.0 | 0 |
| 1176.0 | 0 |
| 1175.0 | 0 |
| 1174.0 | 0 |
| 1173.0 | 0 |
| 1172.0 | 0 |
| 1171.0 | 0 |
| 1170.0 | 0 |
| 1169.0 | 0 |
| 1168.0 | 0 |
| 1167.0 | 0 |
| 1166.0 | 0 |
| 1165.0 | 0 |
| 1164.0 | 0 |
| 1163.0 | 0 |
| 1162.0 | 0 |
| 1161.0 | 0 |
| 1160.0 | 0 |
| 1159.0 | 0 |
| 1158.0 | 0 |
| 1157.0 | 0 |
| 1156.0 | 0 |
| 1155.0 | 0 |
| 1154.0 | 0 |
| 1153.0 | 0 |
| 1152.0 | 0 |
| 1151.0 | 0 |
| 1150.0 | 0 |
| 1149.0 | 0 |
| 1148.0 | 0 |
| 1147.0 | 0 |
| 1146.0 | 0 |
| 1145.0 | 0 |
| 1144.0 | 0 |
| 1143.0 | 0 |
| 1142.0 | 0 |
| 1141.0 | 0 |
| 1140.0 | 0 |
| 1139.0 | 0 |
| 1138.0 | 0 |
| 1137.0 | 0 |
| 1136.0 | 0 |
| 1135.0 | 0 |
| 1134.0 | 0 |
| 1133.0 | 0 |
| 1132.0 | 0 |
| 1131.0 | 0 |
| 1130.0 | 0 |
| 1129.0 | 0 |
| 1128.0 | 0 |
| 1127.0 | 0 |
| 1126.0 | 0 |
| 1125.0 | 0 |
| 1124.0 | 0 |
| 1123.0 | 0 |
| 1122.0 | 0 |
| 1121.0 | 0 |
| 1120.0 | 0 |
| 1119.0 | 0 |
| 1118.0 | 0 |
| 1117.0 | 0 |
| 1116.0 | 0 |
| 1115.0 | 0 |
| 1114.0 | 0 |
| 1113.0 | 0 |
| 1112.0 | 0 |
| 1111.0 | 0 |
| 1110.0 | 0 |
| 1109.0 | 0 |
| 1108.0 | 0 |
| 1107.0 | 0 |
| 1106.0 | 0 |
| 1105.0 | 0 |
| 1104.0 | 0 |
| 1103.0 | 0 |
| 1102.0 | 0 |
| 1101.0 | 0 |
| 1100.0 | 0 |
| 1099.0 | 0 |
| 1098.0 | 0 |
| 1097.0 | 0 |
| 1096.0 | 0 |
| 1095.0 | 0 |
| 1094.0 | 0 |
| 1093.0 | 0 |
| 1092.0 | 0 |
| 1091.0 | 0 |
| 1090.0 | 0 |
| 1089.0 | 0 |
| 1088.0 | 0 |
| 1087.0 | 0 |
| 1086.0 | 0 |
| 1085.0 | 0 |
| 1084.0 | 0 |
| 1083.0 | 0 |
| 1082.0 | 0 |
| 1081.0 | 0 |
| 1080.0 | 0 |
| 1079.0 | 0 |
| 1078.0 | 0 |
| 1077.0 | 0 |
| 1076.0 | 0 |
| 1075.0 | 0 |
| 1074.0 | 0 |
| 1073.0 | 0 |
| 1072.0 | 0 |
| 1071.0 | 0 |
| 1070.0 | 0 |
| 1069.0 | 0 |
| 1068.0 | 0 |
| 1067.0 | 0 |
| 1066.0 | 0 |
| 1065.0 | 0 |
| 1064.0 | 0.001 |
| 1063.0 | 0.001 |
| 1062.0 | 0.001 |
| 1061.0 | 0.001 |
| 1060.0 | 0.001 |
| 1059.0 | 0.001 |
| 1058.0 | 0.001 |
| 1057.0 | 0.001 |
| 1056.0 | 0.001 |
| 1055.0 | 0.001 |
| 1054.0 | 0.001 |
| 1053.0 | 0.001 |
| 1052.0 | 0 |
| 1051.0 | 0 |
| 1050.0 | 0 |
| 1049.0 | 0 |
| 1048.0 | 0.001 |
| 1047.0 | 0.001 |
| 1046.0 | 0.001 |
| 1045.0 | 0.001 |
| 1044.0 | 0.001 |
| 1043.0 | 0.001 |
| 1042.0 | 0.002 |
| 1041.0 | 0.002 |
| 1040.0 | 0.002 |
| 1039.0 | 0.002 |
| 1038.0 | 0.001 |
| 1037.0 | 0.001 |
| 1036.0 | 0.001 |
| 1035.0 | 0.001 |
| 1034.0 | 0.001 |
| 1033.0 | 0.001 |
| 1032.0 | 0.001 |
| 1031.0 | 0 |
| 1030.0 | 0 |
| 1029.0 | 0.001 |
| 1028.0 | 0.001 |
| 1027.0 | 0.001 |
| 1026.0 | 0.001 |
| 1025.0 | 0.001 |
| 1024.0 | 0.001 |
| 1023.0 | 0.001 |
| 1022.0 | 0.001 |
| 1021.0 | 0.002 |
| 1020.0 | 0.001 |
| 1019.0 | 0.001 |
| 1018.0 | 0.001 |
| 1017.0 | 0.001 |
| 1016.0 | 0.001 |
| 1015.0 | 0.001 |
| 1014.0 | 0.001 |
| 1013.0 | 0.001 |
| 1012.0 | 0 |
| 1011.0 | 0 |
| 1010.0 | 0 |
| 1009.0 | 0 |
| 1008.0 | 0.001 |
| 1007.0 | 0 |
| 1006.0 | 0.001 |
| 1005.0 | 0.001 |
| 1004.0 | 0.001 |
| 1003.0 | 0.001 |
| 1002.0 | 0.001 |
| 1001.0 | 0.001 |
| 1000.0 | 0.001 |
| 999.0 | 0.001 |
| 998.0 | 0.001 |
| 997.0 | 0.001 |
| 996.0 | 0.001 |
| 995.0 | 0.001 |
| 994.0 | 0.001 |
| 993.0 | 0.001 |
| 992.0 | 0.001 |
| 991.0 | 0.001 |
| 990.0 | 0.001 |
| 989.0 | 0.001 |
| 988.0 | 0.001 |
| 987.0 | 0.001 |
| 986.0 | 0.001 |
| 985.0 | 0 |
| 984.0 | 0.001 |
| 983.0 | 0.001 |
| 982.0 | 0.001 |
| 981.0 | 0.001 |
| 980.0 | 0.001 |
| 979.0 | 0.001 |
| 978.0 | 0.001 |
| 977.0 | 0.001 |
| 976.0 | 0.001 |
| 975.0 | 0.001 |
| 974.0 | 0.001 |
| 973.0 | 0.001 |
| 972.0 | 0.001 |
| 971.0 | 0.001 |
| 970.0 | 0.001 |
| 969.0 | 0.001 |
| 968.0 | 0.001 |
| 967.0 | 0.001 |
| 966.0 | 0.001 |
| 965.0 | 0.001 |
| 964.0 | 0.001 |
| 963.0 | 0.001 |
| 962.0 | 0.001 |
| 961.0 | 0.001 |
| 960.0 | 0.001 |
| 959.0 | 0 |
| 958.0 | 0 |
| 957.0 | 0.001 |
| 956.0 | 0.001 |
| 955.0 | 0.001 |
| 954.0 | 0.001 |
| 953.0 | 0.001 |
| 952.0 | 0.001 |
| 951.0 | 0.001 |
| 950.0 | 0.001 |
| 949.0 | 0.001 |
| 948.0 | 0.001 |
| 947.0 | 0.001 |
| 946.0 | 0.001 |
| 945.0 | 0.001 |
| 944.0 | 0.001 |
| 943.0 | 0.001 |
| 942.0 | 0.001 |
| 941.0 | 0.001 |
| 940.0 | 0.001 |
| 939.0 | 0.001 |
| 938.0 | 0.001 |
| 937.0 | 0.001 |
| 936.0 | 0.001 |
| 935.0 | 0.001 |
| 934.0 | 0.001 |
| 933.0 | 0.001 |
| 932.0 | 0.001 |
| 931.0 | 0.001 |
| 930.0 | 0.001 |
| 929.0 | 0.001 |
| 928.0 | 0.001 |
| 927.0 | 0.001 |
| 926.0 | 0.001 |
| 925.0 | 0.001 |
| 924.0 | 0.001 |
| 923.0 | 0.001 |
| 922.0 | 0.001 |
| 921.0 | 0.001 |
| 920.0 | 0.001 |
| 919.0 | 0.001 |
| 918.0 | 0.001 |
| 917.0 | 0.001 |
| 916.0 | 0.001 |
| 915.0 | 0.001 |
| 914.0 | 0.001 |
| 913.0 | 0.001 |
| 912.0 | 0.001 |
| 911.0 | 0.001 |
| 910.0 | 0.001 |
| 909.0 | 0.001 |
| 908.0 | 0.001 |
| 907.0 | 0.001 |
| 906.0 | 0.001 |
| 905.0 | 0.001 |
| 904.0 | 0.001 |
| 903.0 | 0.001 |
| 902.0 | 0.001 |
| 901.0 | 0.001 |
| 900.0 | 0.001 |
| 899.0 | 0.001 |
| 898.0 | 0.001 |
| 897.0 | 0.001 |
| 896.0 | 0.001 |
| 895.0 | 0.001 |
| 894.0 | 0.001 |
| 893.0 | 0.001 |
| 892.0 | 0.001 |
| 891.0 | 0.001 |
| 890.0 | 0.001 |
| 889.0 | 0.001 |
| 888.0 | 0.001 |
| 887.0 | 0.001 |
| 886.0 | 0.001 |
| 885.0 | 0.001 |
| 884.0 | 0.001 |
| 883.0 | 0.001 |
| 882.0 | 0.001 |
| 881.0 | 0.001 |
| 880.0 | 0.001 |
| 879.0 | 0.001 |
| 878.0 | 0.001 |
| 877.0 | 0.001 |
| 876.0 | 0.001 |
| 875.0 | 0.001 |
| 874.0 | 0.001 |
| 873.0 | 0.001 |
| 872.0 | 0 |
| 871.0 | 0 |
| 870.0 | 0 |
| 869.0 | 0 |
| 868.0 | 0.001 |
| 867.0 | 0 |
| 866.0 | 0.001 |
| 865.0 | 0 |
| 864.0 | 0 |
| 863.0 | 0 |
| 862.0 | 0 |
| 861.0 | 0 |
| 860.0 | 0 |
| 859.0 | 0 |
| 858.0 | 0 |
| 857.0 | 0 |
| 856.0 | 0 |
| 855.0 | 0 |
| 854.0 | 0 |
| 853.0 | 0 |
| 852.0 | 0 |
| 851.0 | 0 |
| 850.0 | 0 |
| 849.0 | 0 |
| 848.0 | 0 |
| 847.0 | 0 |
| 846.0 | 0 |
| 845.0 | 0 |
| 844.0 | 0 |
| 843.0 | 0 |
| 842.0 | 0 |
| 841.0 | 0 |
| 840.0 | 0 |
| 839.0 | 0 |
| 838.0 | 0 |
| 837.0 | 0 |
| 836.0 | 0 |
| 835.0 | 0 |
| 834.0 | 0 |
| 833.0 | 0 |
| 832.0 | 0 |
| 831.0 | 0 |
| 830.0 | 0 |
| 829.0 | 0 |
| 828.0 | 0 |
| 827.0 | 0 |
| 826.0 | 0 |
| 825.0 | 0 |
| 824.0 | 0 |
| 823.0 | 0 |
| 822.0 | 0 |
| 821.0 | 0 |
| 820.0 | 0 |
| 819.0 | 0 |
| 818.0 | 0 |
| 817.0 | 0 |
| 816.0 | 0 |
| 815.0 | 0 |
| 814.0 | 0 |
| 813.0 | 0 |
| 812.0 | 0 |
| 811.0 | 0 |
| 810.0 | 0 |
| 809.0 | 0 |
| 808.0 | 0 |
| 807.0 | -0.001 |
| 806.0 | 0 |
| 805.0 | 0 |
| 804.0 | 0 |
| 803.0 | 0 |
| 802.0 | 0 |
| 801.0 | 0 |
| 800.0 | 0 |
| 799.0 | 0 |
| 798.0 | 0 |
| 797.0 | 0 |
| 796.0 | 0 |
| 795.0 | 0 |
| 794.0 | 0 |
| 793.0 | 0 |
| 792.0 | 0 |
| 791.0 | 0 |
| 790.0 | 0 |
| 789.0 | 0 |
| 788.0 | 0 |
| 787.0 | 0 |
| 786.0 | 0 |
| 785.0 | 0 |
| 784.0 | 0 |
| 783.0 | 0.001 |
| 782.0 | 0.004 |
| 781.0 | 0.005 |
| 780.0 | 0.002 |
| 779.0 | 0 |
| 778.0 | 0 |
| 777.0 | 0 |
| 776.0 | 0 |
| 775.0 | 0 |
| 774.0 | 0 |
| 773.0 | 0 |
| 772.0 | 0 |
| 771.0 | 0 |
| 770.0 | 0 |
| 769.0 | 0 |
| 768.0 | 0.001 |
| 767.0 | 0.001 |
| 766.0 | 0.004 |
| 765.0 | 0.01 |
| 764.0 | 0.016 |
| 763.0 | 0.013 |
| 762.0 | 0.006 |
| 761.0 | 0.003 |
| 760.0 | 0.002 |
| 759.0 | 0.001 |
| 758.0 | 0.001 |
| 757.0 | 0.001 |
| 756.0 | 0.001 |
| 755.0 | 0.001 |
| 754.0 | 0.002 |
| 753.0 | 0.003 |
| 752.0 | 0.004 |
| 751.0 | 0.009 |
| 750.0 | 0.014 |
| 749.0 | 0.016 |
| 748.0 | 0.011 |
| 747.0 | 0.006 |
| 746.0 | 0.003 |
| 745.0 | 0.002 |
| 744.0 | 0.002 |
| 743.0 | 0.001 |
| 742.0 | 0.001 |
| 741.0 | 0.001 |
| 740.0 | 0.001 |
| 739.0 | 0.001 |
| 738.0 | 0.001 |
| 737.0 | 0.001 |
| 736.0 | 0.001 |
| 735.0 | 0.002 |
| 734.0 | 0.003 |
| 733.0 | 0.004 |
| 732.0 | 0.005 |
| 731.0 | 0.006 |
| 730.0 | 0.006 |
| 729.0 | 0.004 |
| 728.0 | 0.003 |
| 727.0 | 0.002 |
| 726.0 | 0.002 |
| 725.0 | 0.001 |
| 724.0 | 0.001 |
| 723.0 | 0.001 |
| 722.0 | 0.001 |
| 721.0 | 0.001 |
| 720.0 | 0.001 |
| 719.0 | 0.001 |
| 718.0 | 0.001 |
| 717.0 | 0.001 |
| 716.0 | 0.001 |
| 715.0 | 0.002 |
| 714.0 | 0.002 |
| 713.0 | 0.003 |
| 712.0 | 0.004 |
| 711.0 | 0.004 |
| 710.0 | 0.003 |
| 709.0 | 0.002 |
| 708.0 | 0.002 |
| 707.0 | 0.001 |
| 706.0 | 0.001 |
| 705.0 | 0.001 |
| 704.0 | 0.001 |
| 703.0 | 0.001 |
| 702.0 | 0.001 |
| 701.0 | 0.001 |
| 700.0 | 0.001 |
| 699.0 | 0.001 |
| 698.0 | 0.001 |
| 697.0 | 0.001 |
| 696.0 | 0.001 |
| 695.0 | 0.002 |
| 694.0 | 0.002 |
| 693.0 | 0.002 |
| 692.0 | 0.002 |
| 691.0 | 0.001 |
| 690.0 | 0.001 |
| 689.0 | 0.001 |
| 688.0 | 0.001 |
| 687.0 | 0 |
| 686.0 | 0 |
| 685.0 | 0 |
| 684.0 | 0 |
| 683.0 | 0 |
| 682.0 | 0 |
| 681.0 | 0 |
| 680.0 | 0 |
| 679.0 | 0 |
| 678.0 | 0.001 |
| 677.0 | 0.001 |
| 676.0 | 0.001 |
| 675.0 | 0.001 |
| 674.0 | 0.001 |
| 673.0 | 0 |
| 672.0 | 0 |
| 671.0 | 0 |
| 670.0 | 0 |
| 669.0 | 0 |
| 668.0 | 0 |
| 667.0 | 0 |
| 666.0 | 0 |
| 665.0 | 0 |
| 664.0 | 0 |
| 663.0 | 0 |
| 662.0 | 0 |
| 661.0 | 0 |
| 660.0 | 0 |
| 659.0 | 0 |
| 658.0 | 0 |
| 657.0 | 0 |
| 656.0 | 0 |
| 655.0 | 0 |
| 654.0 | 0 |
| 653.0 | 0 |
| 652.0 | 0 |
| 651.0 | 0 |
| 650.0 | 0 |
| 649.0 | 0 |
| 648.0 | 0 |
| 647.0 | 0 |
| 646.0 | 0 |
| 645.0 | 0 |
| 644.0 | 0 |
| 643.0 | 0 |
| 642.0 | 0 |
| 641.0 | 0 |
| 640.0 | 0 |
| 639.0 | 0 |
| 638.0 | 0 |
| 637.0 | 0 |
| 636.0 | 0 |
| 635.0 | 0 |
| 634.0 | 0 |
| 633.0 | 0 |
| 632.0 | 0 |
| 631.0 | 0 |
| 630.0 | 0 |
| 629.0 | 0 |
| 628.0 | 0 |
| 627.0 | 0 |
| 626.0 | 0 |
| 625.0 | 0 |
| 624.0 | 0 |
| 623.0 | 0 |
| 622.0 | 0 |
| 621.0 | 0 |
| 620.0 | 0 |
| 619.0 | 0 |
| 618.0 | 0 |
| 617.0 | 0 |
| 616.0 | 0 |
| 615.0 | 0 |
| 614.0 | 0 |
| 613.0 | 0 |
| 612.0 | 0 |
| 611.0 | 0 |
| 610.0 | 0 |
| 609.0 | 0 |
| 608.0 | 0 |
| 607.0 | 0 |
| 606.0 | 0 |
| 605.0 | 0 |
| 604.0 | 0 |
| 603.0 | 0 |
| 602.0 | 0 |
| 601.0 | 0 |
| 600.0 | 0 |
| 599.0 | 0 |
| 598.0 | 0 |
| 597.0 | 0 |
| 596.0 | 0 |
| 595.0 | 0 |
| 594.0 | 0 |
| 593.0 | 0 |
| 592.0 | 0 |
| 591.0 | 0 |
| 590.0 | 0 |
| 589.0 | 0 |
| 588.0 | 0 |
| 587.0 | 0 |
| 586.0 | 0 |
| 585.0 | 0 |
| 584.0 | 0 |
| 583.0 | 0 |
| 582.0 | 0 |
| 581.0 | 0 |
| 580.0 | 0 |
| 579.0 | 0 |
| 578.0 | 0 |
| 577.0 | 0 |
| 576.0 | 0 |
| 575.0 | 0 |
| 574.0 | 0 |
| 573.0 | 0 |
| 572.0 | 0 |
| 571.0 | 0 |
| 570.0 | 0 |
| 569.0 | 0 |
| 568.0 | 0 |
| 567.0 | 0 |
| 566.0 | 0 |
| 565.0 | 0 |
| 564.0 | 0 |
| 563.0 | 0 |
| 562.0 | 0 |
| 561.0 | 0 |
| 560.0 | 0 |
| 559.0 | 0 |
| 558.0 | 0 |
| 557.0 | 0 |
| 556.0 | 0 |
| 555.0 | 0 |
| 554.0 | 0 |
| 553.0 | 0 |
| 552.0 | 0 |
| 551.0 | 0 |
| 550.0 | 0 |
| 549.0 | 0 |
| 548.0 | 0 |
| 547.0 | 0 |
| 546.0 | 0 |
| 545.0 | 0 |
| 544.0 | 0 |
| 543.0 | 0 |
| 542.0 | 0 |
| 541.0 | 0 |
| 540.0 | 0 |
| 539.0 | 0 |
| 538.0 | 0 |
| 537.0 | 0 |
| 536.0 | 0 |
| 535.0 | 0 |
| 534.0 | 0 |
| 533.0 | 0 |
| 532.0 | 0 |
| 531.0 | 0 |
| 530.0 | 0 |
| 529.0 | 0 |
| 528.0 | 0 |
| 527.0 | 0 |
| 526.0 | 0 |
| 525.0 | 0 |
| 524.0 | 0 |
| 523.0 | 0 |
| 522.0 | 0 |
| 521.0 | 0 |
| 520.0 | 0 |
| 519.0 | 0 |
| 518.0 | 0 |
| 517.0 | 0 |
| 516.0 | 0 |
| 515.0 | 0 |
| 514.0 | 0 |
| 513.0 | 0 |
| 512.0 | 0 |
| 511.0 | 0 |
| 510.0 | 0 |
| 509.0 | 0 |
| 508.0 | 0 |
| 507.0 | 0 |
| 506.0 | 0 |
| 505.0 | 0 |
| 504.0 | 0 |
| 503.0 | 0 |
| 502.0 | 0 |
| 501.0 | 0 |
| 500.0 | 0 |
| 499.0 | 0 |
| 498.0 | 0 |
| 497.0 | 0 |
| 496.0 | 0 |
| 495.0 | 0 |
| 494.0 | 0 |
| 493.0 | 0 |
| 492.0 | 0 |
| 491.0 | 0 |
| 490.0 | 0 |
| 489.0 | 0 |
| 488.0 | 0 |
| 487.0 | 0 |
| 486.0 | 0 |
| 485.0 | 0 |
| 484.0 | 0 |
| 483.0 | 0 |
| 482.0 | 0 |
| 481.0 | 0 |
| 480.0 | 0 |
| 479.0 | 0 |
| 478.0 | 0 |
| 477.0 | 0 |
| 476.0 | 0 |
| 475.0 | 0 |
| 474.0 | 0 |
| 473.0 | 0 |
| 472.0 | 0 |
| 471.0 | 0 |
| 470.0 | 0 |
| 469.0 | 0 |
| 468.0 | 0 |
| 467.0 | 0 |
| 466.0 | 0 |
| 465.0 | 0 |
| 464.0 | 0 |
| 463.0 | 0 |
| 462.0 | 0 |
| 461.0 | 0 |
| 460.0 | 0 |
| 459.0 | 0 |
| 458.0 | 0 |
| 457.0 | 0 |
| 456.0 | 0 |
| 455.0 | 0 |
| 454.0 | 0 |
| 453.0 | 0 |
| 452.0 | 0 |
| 451.0 | 0 |
| 450.0 | 0 |
| 449.0 | 0 |
| 448.0 | 0 |
| 447.0 | 0 |
| 446.0 | 0 |
| 445.0 | 0 |
| 444.0 | 0 |
| 443.0 | 0 |
| 442.0 | 0 |
| 441.0 | 0 |
| 440.0 | 0 |
| 439.0 | 0 |
| 438.0 | 0 |
| 437.0 | 0 |
| 436.0 | 0 |
| 435.0 | 0 |
| 434.0 | 0 |
| 433.0 | 0 |
| 432.0 | 0 |
| 431.0 | 0 |
| 430.0 | 0 |
| 429.0 | 0 |
| 428.0 | 0 |
| 427.0 | 0 |
| 426.0 | 0 |
| 425.0 | 0 |
| 424.0 | 0 |
| 423.0 | 0 |
| 422.0 | 0 |
| 421.0 | 0 |
| 420.0 | 0 |
| 419.0 | 0 |
| 418.0 | 0 |
| 417.0 | 0 |
| 416.0 | 0 |
| 415.0 | 0 |
| 414.0 | 0 |
| 413.0 | 0 |
| 412.0 | 0 |
| 411.0 | 0 |
| 410.0 | 0 |
| 409.0 | 0 |
| 408.0 | 0 |
| 407.0 | 0 |
| 406.0 | 0 |
| 405.0 | 0 |
| 404.0 | 0 |
| 403.0 | 0 |
| 402.0 | 0 |
| 401.0 | 0 |
| 400.0 | 0 |
| 399.0 | 0 |
| 398.0 | 0 |
| 397.0 | 0 |
| 396.0 | 0 |
| 395.0 | 0 |
| 394.0 | 0 |
| 393.0 | 0 |
| 392.0 | 0 |
| 391.0 | 0 |
| 390.0 | 0 |
| 389.0 | 0 |
| 388.0 | 0 |
| 387.0 | 0 |
| 386.0 | 0 |
| 385.0 | 0 |
| 384.0 | 0 |
| 383.0 | 0 |
| 382.0 | 0 |
| 381.0 | 0 |
| 380.0 | 0 |
| 379.0 | 0 |
| 378.0 | 0 |
| 377.0 | 0 |
| 376.0 | 0 |
| 375.0 | 0 |
| 374.0 | 0 |
| 373.0 | 0 |
| 372.0 | 0 |
| 371.0 | 0 |
| 370.0 | 0 |
| 369.0 | 0 |
| 368.0 | 0 |
| 367.0 | 0 |
| 366.0 | 0 |
| 365.0 | 0 |
| 364.0 | 0 |
| 363.0 | 0 |
| 362.0 | 0 |
| 361.0 | 0 |
| 360.0 | 0 |
| 359.0 | 0 |
| 358.0 | 0 |
| 357.0 | 0 |
| 356.0 | 0 |
| 355.0 | 0 |
| 354.0 | 0 |
| 353.0 | 0 |
| 352.0 | 0 |
| 351.0 | 0 |
| 350.0 | 0 |
| 349.0 | 0 |
| 348.0 | 0 |
| 347.0 | 0 |
| 346.0 | 0 |
| 345.0 | 0 |
| 344.0 | 0 |
| 343.0 | 0 |
| 342.0 | 0 |
| 341.0 | 0 |
| 340.0 | 0 |
| 339.0 | 0 |
| 338.0 | 0 |
| 337.0 | 0 |
| 336.0 | 0 |
| 335.0 | 0 |
| 334.0 | 0 |
| 333.0 | 0 |
| 332.0 | 0 |
| 331.0 | 0 |
| 330.0 | 0 |
| 329.0 | 0 |
| 328.0 | 0 |
| 327.0 | 0 |
| 326.0 | 0 |
| 325.0 | 0 |
| 324.0 | 0 |
| 323.0 | 0 |
| 322.0 | 0 |
| 321.0 | 0 |
| 320.0 | 0 |
| 319.0 | 0 |
| 318.0 | 0 |
| 317.0 | 0 |
| 316.0 | 0 |
| 315.0 | 0 |
| 314.0 | 0 |
| 313.0 | 0 |
| 312.0 | 0 |
| 311.0 | 0 |
| 310.0 | 0 |
| 309.0 | 0 |
| 308.0 | 0 |
| 307.0 | 0 |
| 306.0 | 0 |
| 305.0 | 0 |
| 304.0 | 0 |
| 303.0 | 0 |
| 302.0 | 0 |
| 301.0 | 0 |
| 300.0 | 0 |
| 299.0 | 0 |
| 298.0 | 0 |
| 297.0 | 0 |
| 296.0 | 0 |
| 295.0 | 0 |
| 294.0 | 0 |
| 293.0 | 0 |
| 292.0 | 0 |
| 291.0 | 0 |
| 290.0 | 0 |
| 289.0 | 0 |
| 288.0 | 0 |
| 287.0 | 0 |
| 286.0 | 0 |
| 285.0 | 0 |
| 284.0 | 0 |
| 283.0 | 0 |
| 282.0 | 0 |
| 281.0 | 0 |
| 280.0 | 0 |
| 279.0 | 0 |
| 278.0 | 0 |
| 277.0 | 0 |
| 276.0 | 0 |
| 275.0 | 0 |
| 274.0 | 0 |
| 273.0 | 0 |
| 272.0 | 0 |
| 271.0 | 0 |
| 270.0 | 0 |
| 269.0 | 0 |
| 268.0 | 0 |
| 267.0 | 0 |
| 266.0 | 0 |
| 265.0 | 0 |
| 264.0 | 0 |
| 263.0 | 0 |
| 262.0 | 0 |
| 261.0 | 0 |
| 260.0 | 0 |
| 259.0 | 0 |
| 258.0 | 0 |
| 257.0 | 0 |
| 256.0 | 0 |
| 255.0 | 0 |
| 254.0 | 0 |
| 253.0 | 0 |
| 252.0 | 0 |
| 251.0 | 0 |
| 250.0 | 0 |
| 249.0 | 0 |
| 248.0 | 0 |
| 247.0 | 0 |
| 246.0 | 0 |
| 245.0 | 0 |
| 244.0 | 0 |
| 243.0 | 0 |
| 242.0 | 0 |
| 241.0 | 0 |
| 240.0 | 0 |
| 239.0 | 0 |
| 238.0 | 0 |
| 237.0 | 0 |
| 236.0 | 0 |
| 235.0 | 0 |
| 234.0 | 0 |
| 233.0 | 0 |
| 232.0 | 0 |
| 231.0 | 0 |
| 230.0 | 0 |
| 229.0 | 0 |
| 228.0 | 0 |
| 227.0 | 0 |
| 226.0 | 0 |
| 225.0 | 0 |
| 224.0 | 0 |
| 223.0 | 0 |
| 222.0 | 0 |
| 221.0 | 0 |
| 220.0 | 0 |